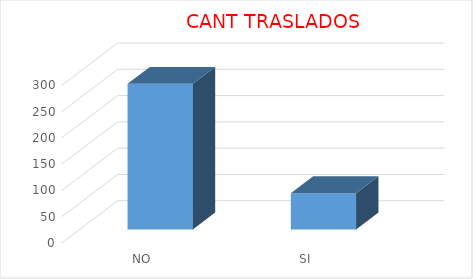
| Category | CANT |
|---|---|
| NO | 277 |
| SI | 69 |